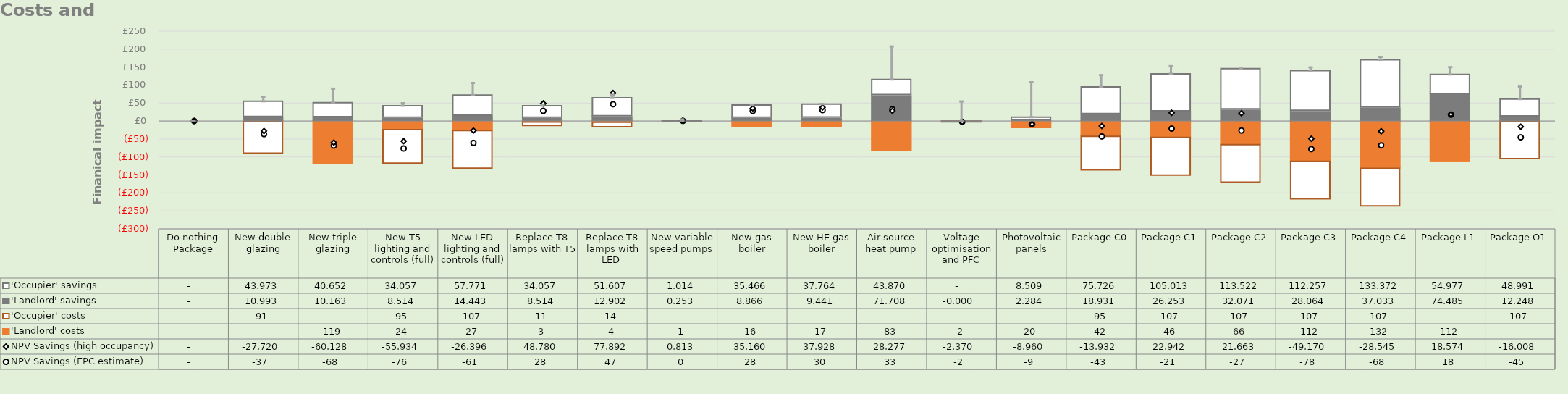
| Category | 'Landlord' costs | 'Occupier' costs | 'Landlord' savings | 'Occupier' savings |
|---|---|---|---|---|
| Do nothing Package | 0 | 0 | 0 | 0 |
| New double glazing | 0 | -91.481 | 10.993 | 43.973 |
| New triple glazing | -119.074 | 0 | 10.163 | 40.652 |
| New T5 lighting and controls (full) | -23.787 | -95.149 | 8.514 | 34.057 |
| New LED lighting and controls (full) | -26.632 | -106.527 | 14.443 | 57.771 |
| Replace T8 lamps with T5 | -2.845 | -11.378 | 8.514 | 34.057 |
| Replace T8 lamps with LED  | -3.556 | -14.223 | 12.902 | 51.607 |
| New variable speed pumps | -0.948 | 0 | 0.253 | 1.014 |
| New gas boiler | -16.265 | 0 | 8.866 | 35.466 |
| New HE gas boiler | -16.83 | 0 | 9.441 | 37.764 |
| Air source heat pump | -82.899 | 0 | 71.708 | 43.87 |
| Voltage optimisation and PFC | -2.37 | 0 | 0 | 0 |
| Photovoltaic panels | -19.753 | 0 | 2.284 | 8.509 |
| Package C0 | -42.423 | -95.149 | 18.931 | 75.726 |
| Package C1 | -45.832 | -106.527 | 26.253 | 105.013 |
| Package C2 | -65.586 | -106.527 | 32.071 | 113.522 |
| Package C3 | -111.901 | -106.527 | 28.064 | 112.257 |
| Package C4 | -131.654 | -106.527 | 37.033 | 133.372 |
| Package L1 | -111.901 | 0 | 74.485 | 54.977 |
| Package O1 | 0 | -106.527 | 12.248 | 48.991 |